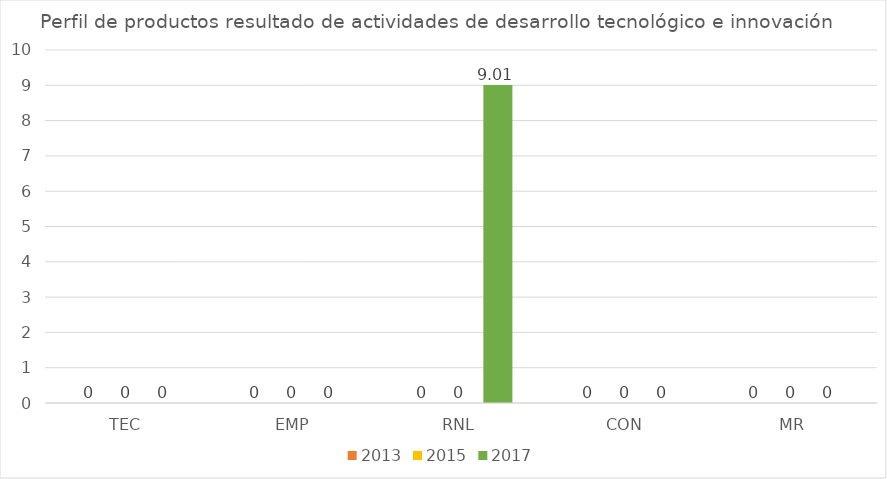
| Category | 2013 | 2015 | 2017 |
|---|---|---|---|
| TEC | 0 | 0 | 0 |
| EMP | 0 | 0 | 0 |
| RNL | 0 | 0 | 9.01 |
| CON | 0 | 0 | 0 |
| MR | 0 | 0 | 0 |